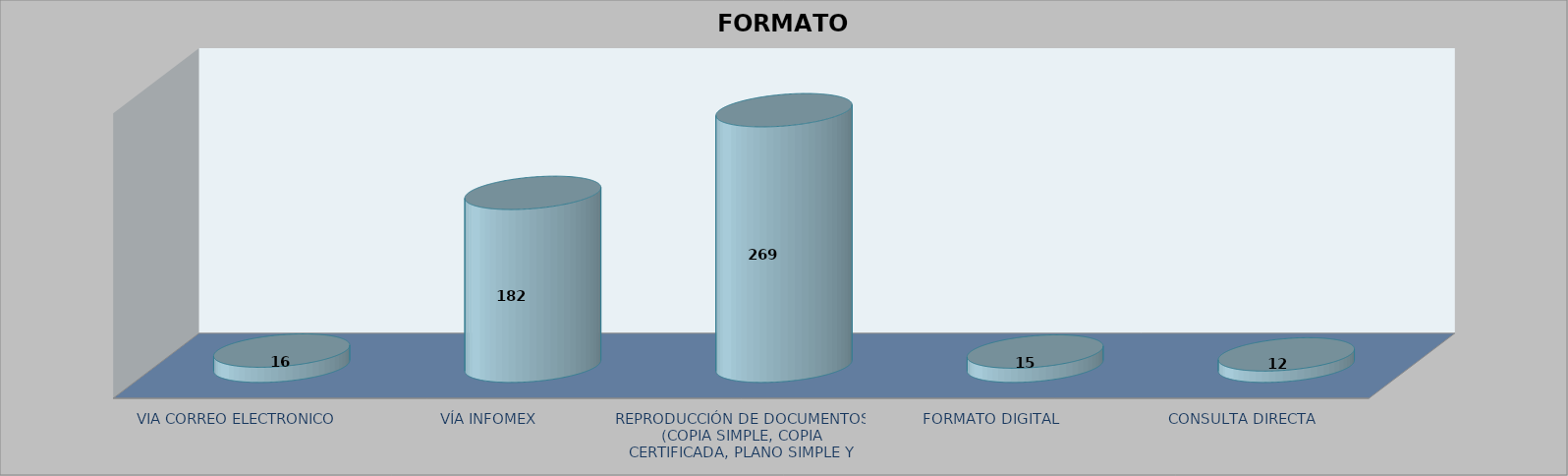
| Category |        FORMATO SOLICITADO | Series 1 | Series 2 |
|---|---|---|---|
| VIA CORREO ELECTRONICO |  |  | 16 |
| VÍA INFOMEX |  |  | 182 |
| REPRODUCCIÓN DE DOCUMENTOS (COPIA SIMPLE, COPIA CERTIFICADA, PLANO SIMPLE Y PLANO CERTIFICADO) |  |  | 269 |
| FORMATO DIGITAL |  |  | 15 |
| CONSULTA DIRECTA |  |  | 12 |